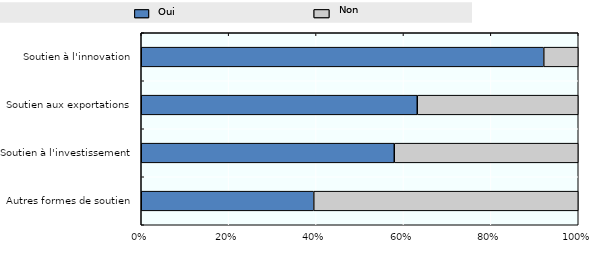
| Category | Oui | Non |
|---|---|---|
| Soutien à l'innovation | 35 | 3 |
| Soutien aux exportations | 24 | 14 |
| Soutien à l'investissement | 22 | 16 |
| Autres formes de soutien | 15 | 23 |